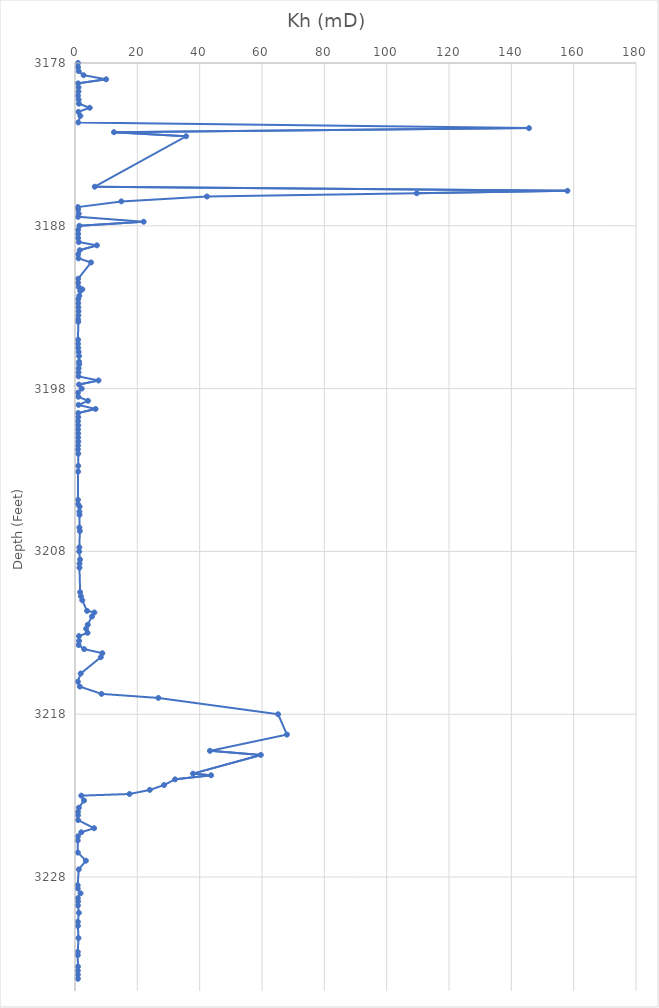
| Category | Kh (mD) |
|---|---|
| 0.9696666666666666 | 3178 |
| 0.9596666666666667 | 3178.25 |
| 1.1833333333333333 | 3178.5 |
| 2.7533333333333334 | 3178.75 |
| 9.99 | 3179 |
| 0.9950000000000001 | 3179.25 |
| 1.1266666666666667 | 3179.5 |
| 1.1133333333333333 | 3179.75 |
| 0.979 | 3180 |
| 1.1566666666666665 | 3180.25 |
| 1.26 | 3180.5 |
| 4.7299999999999995 | 3180.75 |
| 1.0966666666666667 | 3181 |
| 1.7233333333333334 | 3181.25 |
| 1.0466666666666666 | 3181.65 |
| 145.66666666666666 | 3182 |
| 12.5 | 3182.25 |
| 35.63333333333333 | 3182.5 |
| 6.336666666666666 | 3185.6 |
| 158.0 | 3185.85 |
| 109.66666666666667 | 3186 |
| 42.333333333333336 | 3186.2 |
| 14.866666666666667 | 3186.5 |
| 0.9496666666666668 | 3186.85 |
| 1.0033333333333332 | 3187 |
| 1.1966666666666665 | 3187.25 |
| 0.9806666666666667 | 3187.45 |
| 22.03333333333333 | 3187.75 |
| 1.413333333333333 | 3188 |
| 0.9786666666666667 | 3188.25 |
| 1.0026666666666666 | 3188.5 |
| 0.9883333333333333 | 3188.75 |
| 1.2133333333333334 | 3189 |
| 7.023333333333333 | 3189.2 |
| 1.5033333333333332 | 3189.5 |
| 0.992 | 3189.75 |
| 1.1133333333333333 | 3190 |
| 5.1499999999999995 | 3190.25 |
| 1.0166666666666666 | 3191.25 |
| 0.9856666666666666 | 3191.5 |
| 1.1566666666666667 | 3191.75 |
| 2.356666666666667 | 3191.9 |
| 1.6866666666666665 | 3192 |
| 1.3733333333333333 | 3192.3 |
| 1.0343333333333333 | 3192.5 |
| 1.0350000000000001 | 3192.75 |
| 1.0533333333333335 | 3193 |
| 1.11 | 3193.25 |
| 1.0833333333333333 | 3193.5 |
| 0.9906666666666667 | 3193.75 |
| 1.0266666666666666 | 3193.9 |
| 0.9873333333333333 | 3195 |
| 0.9720000000000001 | 3195.25 |
| 1.0266666666666666 | 3195.5 |
| 1.15 | 3195.75 |
| 1.2833333333333334 | 3196 |
| 1.2933333333333332 | 3196.35 |
| 1.3333333333333333 | 3196.5 |
| 1.16 | 3196.75 |
| 1.1300000000000001 | 3197 |
| 1.1033333333333335 | 3197.25 |
| 7.55 | 3197.5 |
| 1.29 | 3197.75 |
| 2.1533333333333338 | 3198 |
| 0.9286666666666666 | 3198.25 |
| 1.0633333333333335 | 3198.5 |
| 4.17 | 3198.75 |
| 1.1266666666666667 | 3199 |
| 6.593333333333333 | 3199.25 |
| 1.0066666666666666 | 3199.5 |
| 1.03 | 3199.75 |
| 0.944 | 3200 |
| 1.0333333333333334 | 3200.25 |
| 0.9766666666666666 | 3200.5 |
| 1.0233333333333334 | 3200.75 |
| 1.01 | 3201 |
| 1.0599999999999998 | 3201.25 |
| 0.9813333333333333 | 3201.5 |
| 0.9209999999999999 | 3201.73 |
| 1.0433333333333332 | 3202 |
| 1.022 | 3202.75 |
| 0.9969999999999999 | 3203.1 |
| 0.952 | 3204.83 |
| 0.9716666666666667 | 3205.1 |
| 1.4866666666666666 | 3205.25 |
| 1.41 | 3205.55 |
| 1.4466666666666665 | 3205.75 |
| 1.4133333333333333 | 3206.53 |
| 1.5533333333333335 | 3206.75 |
| 1.3999999999999997 | 3207.75 |
| 1.3466666666666667 | 3208 |
| 1.6166666666666665 | 3208.5 |
| 1.4433333333333334 | 3208.75 |
| 1.43 | 3209 |
| 1.6433333333333333 | 3210.5 |
| 1.8966666666666667 | 3210.75 |
| 2.3366666666666664 | 3211 |
| 3.856666666666667 | 3211.65 |
| 6.223333333333334 | 3211.75 |
| 5.426666666666667 | 3212 |
| 4.096666666666667 | 3212.5 |
| 3.563333333333333 | 3212.75 |
| 4.03 | 3213 |
| 1.2833333333333334 | 3213.2 |
| 1.2966666666666666 | 3213.5 |
| 1.1666666666666667 | 3213.75 |
| 2.936666666666666 | 3214 |
| 8.780000000000001 | 3214.25 |
| 8.27 | 3214.5 |
| 1.83 | 3215.5 |
| 0.8976666666666667 | 3216 |
| 1.54 | 3216.3 |
| 8.506666666666666 | 3216.75 |
| 26.733333333333334 | 3217 |
| 65.16666666666667 | 3218 |
| 68.0 | 3219.25 |
| 43.300000000000004 | 3220.25 |
| 59.63333333333333 | 3220.5 |
| 37.86666666666667 | 3221.65 |
| 43.666666666666664 | 3221.75 |
| 32.1 | 3222 |
| 28.566666666666666 | 3222.35 |
| 24.0 | 3222.65 |
| 17.46666666666667 | 3222.9 |
| 2.0233333333333334 | 3223 |
| 2.893333333333333 | 3223.3 |
| 1.24 | 3223.74 |
| 0.949 | 3224 |
| 0.9543333333333334 | 3224.2 |
| 0.976 | 3224.5 |
| 6.133333333333333 | 3225 |
| 2.025 | 3225.25 |
| 0.9433333333333334 | 3225.5 |
| 0.8903333333333334 | 3225.75 |
| 0.9170000000000001 | 3226.5 |
| 3.4933333333333336 | 3227 |
| 1.2066666666666666 | 3227.53 |
| 0.864 | 3228.5 |
| 0.8773333333333334 | 3228.7 |
| 1.78 | 3229 |
| 0.9036666666666667 | 3229.3 |
| 0.9886666666666667 | 3229.5 |
| 0.9326666666666666 | 3229.75 |
| 1.2366666666666666 | 3230.2 |
| 0.9223333333333333 | 3230.75 |
| 0.9336666666666668 | 3231 |
| 1.1066666666666667 | 3231.75 |
| 0.8896666666666667 | 3232.6 |
| 0.8916666666666666 | 3232.8 |
| 0.9430000000000001 | 3233.5 |
| 0.9049999999999999 | 3233.75 |
| 0.9289999999999999 | 3234 |
| 0.9346666666666666 | 3234.25 |